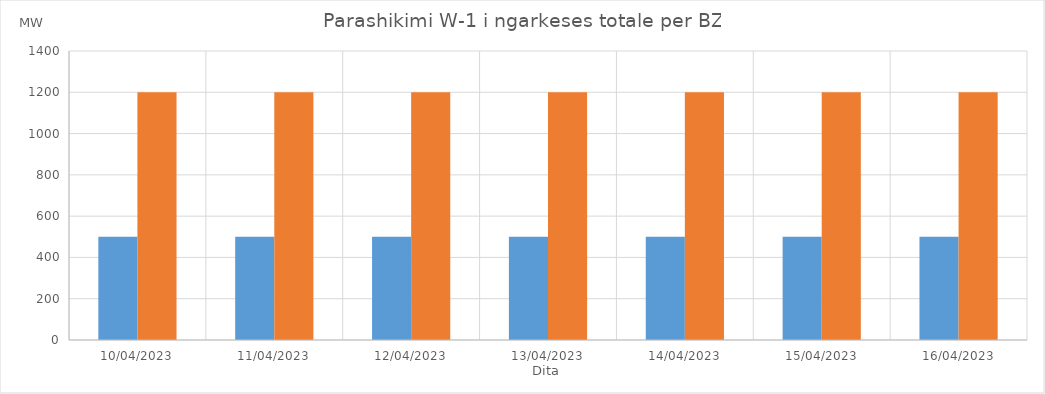
| Category | Min (MW) | Max (MW) |
|---|---|---|
| 10/04/2023 | 500 | 1200 |
| 11/04/2023 | 500 | 1200 |
| 12/04/2023 | 500 | 1200 |
| 13/04/2023 | 500 | 1200 |
| 14/04/2023 | 500 | 1200 |
| 15/04/2023 | 500 | 1200 |
| 16/04/2023 | 500 | 1200 |